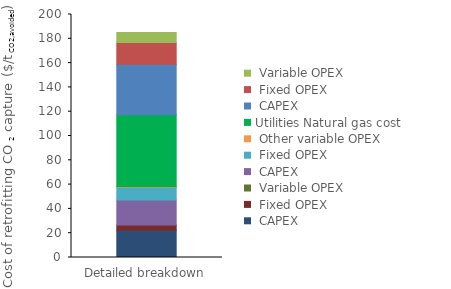
| Category | Interconnecting | Utilities | Series 0 | Series 1 | Series 2 |
|---|---|---|---|---|---|
| 0 | 0 | 59.27 | 41.71 | 17.85 | 8.296 |